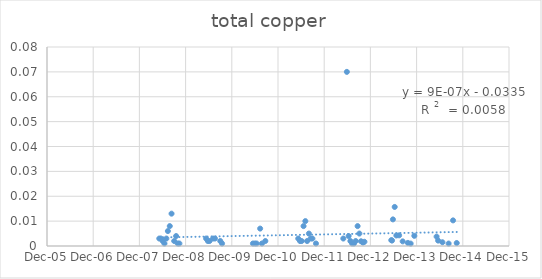
| Category | Series 0 |
|---|---|
| 39577.0 | 0.003 |
| 39590.0 | 0.003 |
| 39604.0 | 0.002 |
| 39618.0 | 0.001 |
| 39633.0 | 0.003 |
| 39645.0 | 0.006 |
| 39660.0 | 0.008 |
| 39674.0 | 0.013 |
| 39695.0 | 0.002 |
| 39710.0 | 0.004 |
| 39723.0 | 0.001 |
| 39736.0 | 0.001 |
| 39947.0 | 0.003 |
| 39961.0 | 0.002 |
| 39974.0 | 0.002 |
| 40002.0 | 0.003 |
| 40017.0 | 0.003 |
| 40059.0 | 0.002 |
| 40073.0 | 0.001 |
| 40317.0 | 0.001 |
| 40332.0 | 0.001 |
| 40346.0 | 0.001 |
| 40374.0 | 0.007 |
| 40388.0 | 0.001 |
| 40415.0 | 0.002 |
| 40675.0 | 0.003 |
| 40689.0 | 0.002 |
| 40702.0 | 0.002 |
| 40717.0 | 0.008 |
| 40731.0 | 0.01 |
| 40745.0 | 0.002 |
| 40759.0 | 0.005 |
| 40773.0 | 0.003 |
| 40787.0 | 0.003 |
| 40815.0 | 0.001 |
| 41031.0 | 0.003 |
| 41059.0 | 0.07 |
| 41073.0 | 0.004 |
| 41087.0 | 0.002 |
| 41101.0 | 0.001 |
| 41115.0 | 0.001 |
| 41129.0 | 0.002 |
| 41144.0 | 0.008 |
| 41158.0 | 0.005 |
| 41171.0 | 0.002 |
| 41186.0 | 0.001 |
| 41198.0 | 0.002 |
| 41410.0 | 0.002 |
| 41416.0 | 0.002 |
| 41423.0 | 0.011 |
| 41437.0 | 0.016 |
| 41450.0 | 0.004 |
| 41472.0 | 0.004 |
| 41500.0 | 0.002 |
| 41541.0 | 0.001 |
| 41563.0 | 0.001 |
| 41592.0 | 0.004 |
| 41768.0 | 0.004 |
| 41780.0 | 0.002 |
| 41814.0 | 0.002 |
| 41863.0 | 0.001 |
| 41898.0 | 0.01 |
| 41927.0 | 0.001 |